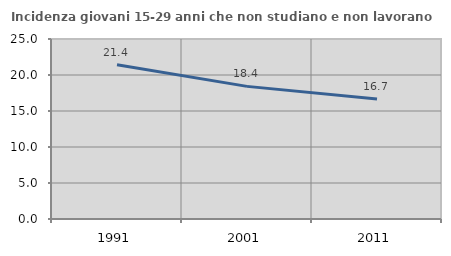
| Category | Incidenza giovani 15-29 anni che non studiano e non lavorano  |
|---|---|
| 1991.0 | 21.429 |
| 2001.0 | 18.421 |
| 2011.0 | 16.667 |